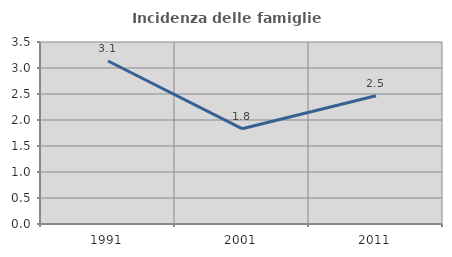
| Category | Incidenza delle famiglie numerose |
|---|---|
| 1991.0 | 3.135 |
| 2001.0 | 1.832 |
| 2011.0 | 2.465 |